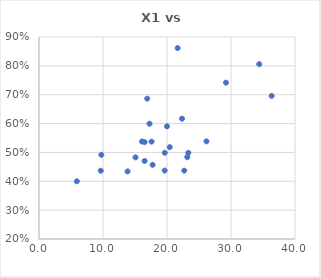
| Category | X2 |
|---|---|
| 34.4167 | 0.806 |
| 36.3478 | 0.696 |
| 19.636400000000002 | 0.437 |
| 20.0 | 0.59 |
| 22.6957 | 0.437 |
| 20.4348 | 0.518 |
| 19.6522 | 0.499 |
| 16.5 | 0.536 |
| 13.833300000000001 | 0.434 |
| 15.0833 | 0.483 |
| 16.9091 | 0.686 |
| 17.2727 | 0.6 |
| 16.5 | 0.47 |
| 16.087 | 0.538 |
| 23.3333 | 0.499 |
| 23.166700000000002 | 0.484 |
| 17.583299999999998 | 0.538 |
| 21.6667 | 0.862 |
| 29.217399999999998 | 0.742 |
| 26.1667 | 0.538 |
| 17.75 | 0.457 |
| 5.91304 | 0.4 |
| 9.65217 | 0.437 |
| 9.73913 | 0.492 |
| 22.3478 | 0.617 |